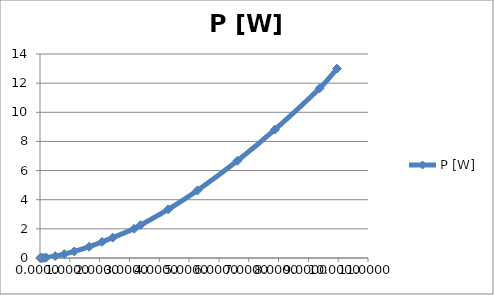
| Category | P [W] |
|---|---|
| 0.0048 | 0 |
| 0.043 | 0.001 |
| 0.068 | 0.003 |
| 0.143 | 0.012 |
| 0.209 | 0.025 |
| 0.509 | 0.13 |
| 0.811 | 0.268 |
| 1.15 | 0.451 |
| 1.65 | 0.774 |
| 2.08 | 1.102 |
| 2.44 | 1.398 |
| 3.16 | 2.007 |
| 3.37 | 2.251 |
| 4.3 | 3.337 |
| 5.28 | 4.636 |
| 6.62 | 6.673 |
| 7.88 | 8.818 |
| 9.38 | 11.65 |
| 9.96 | 12.998 |